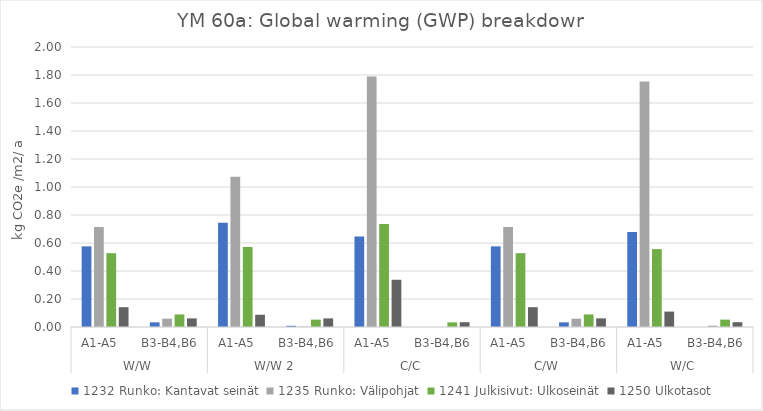
| Category | 1232 Runko: Kantavat seinät | 1235 Runko: Välipohjat | 1241 Julkisivut: Ulkoseinät | 1250 Ulkotasot |
|---|---|---|---|---|
| 0 | 0.576 | 0.714 | 0.527 | 0.141 |
| 1 | 0.033 | 0.059 | 0.09 | 0.062 |
| 2 | 0.745 | 1.074 | 0.571 | 0.087 |
| 3 | 0.009 | 0.003 | 0.053 | 0.062 |
| 4 | 0.646 | 1.789 | 0.735 | 0.337 |
| 5 | 0 | 0 | 0.033 | 0.034 |
| 6 | 0.576 | 0.714 | 0.527 | 0.141 |
| 7 | 0.033 | 0.059 | 0.09 | 0.062 |
| 8 | 0.678 | 1.753 | 0.557 | 0.11 |
| 9 | 0 | 0.01 | 0.053 | 0.034 |